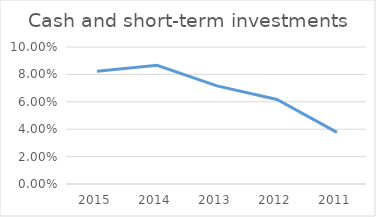
| Category | Cash and short-term investments |
|---|---|
| 2015.0 | 0.082 |
| 2014.0 | 0.087 |
| 2013.0 | 0.072 |
| 2012.0 | 0.062 |
| 2011.0 | 0.038 |